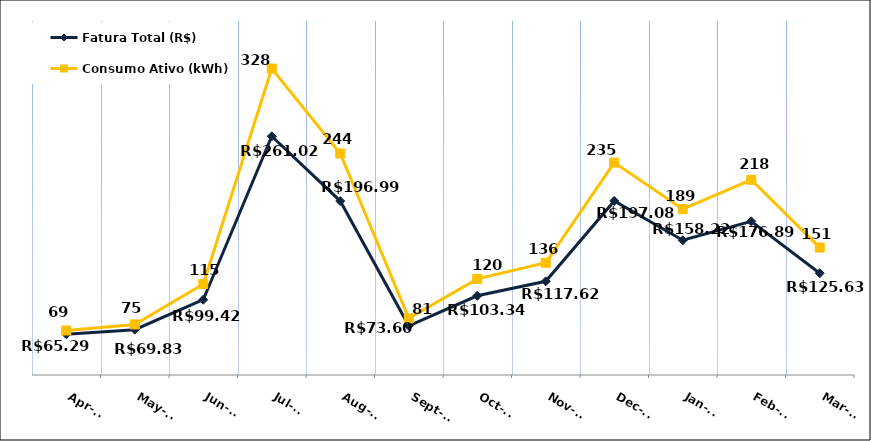
| Category | Fatura Total (R$) |
|---|---|
| 2023-04-01 | 65.29 |
| 2023-05-01 | 69.83 |
| 2023-06-01 | 99.42 |
| 2023-07-01 | 261.02 |
| 2023-08-01 | 196.99 |
| 2023-09-01 | 73.6 |
| 2023-10-01 | 103.34 |
| 2023-11-01 | 117.62 |
| 2023-12-01 | 197.08 |
| 2024-01-01 | 158.22 |
| 2024-02-01 | 176.89 |
| 2024-03-01 | 125.63 |